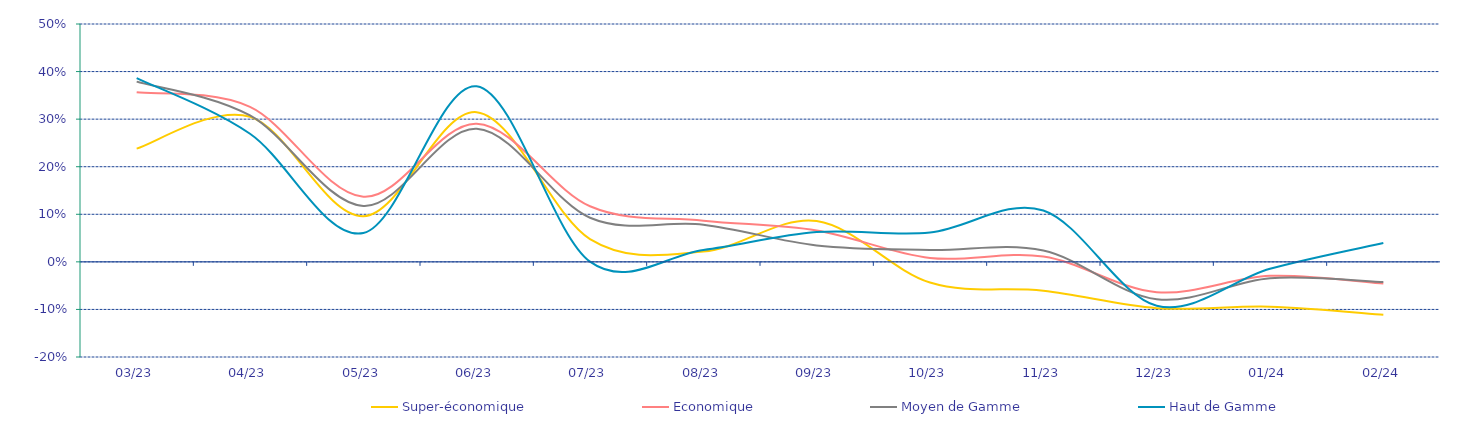
| Category | Super-économique | Economique | Moyen de Gamme | Haut de Gamme |
|---|---|---|---|---|
| 2023-03-08 | 0.238 | 0.357 | 0.379 | 0.386 |
| 2023-04-07 | 0.305 | 0.326 | 0.308 | 0.269 |
| 2023-05-07 | 0.096 | 0.137 | 0.118 | 0.06 |
| 2023-06-06 | 0.315 | 0.29 | 0.28 | 0.369 |
| 2023-07-06 | 0.048 | 0.117 | 0.093 | 0 |
| 2023-08-05 | 0.022 | 0.087 | 0.078 | 0.025 |
| 2023-09-04 | 0.086 | 0.066 | 0.035 | 0.063 |
| 2023-10-04 | -0.043 | 0.008 | 0.025 | 0.062 |
| 2023-11-03 | -0.061 | 0.011 | 0.024 | 0.108 |
| 2023-12-03 | -0.097 | -0.064 | -0.079 | -0.092 |
| 2024-01-02 | -0.094 | -0.029 | -0.034 | -0.015 |
| 2024-02-01 | -0.111 | -0.046 | -0.042 | 0.04 |